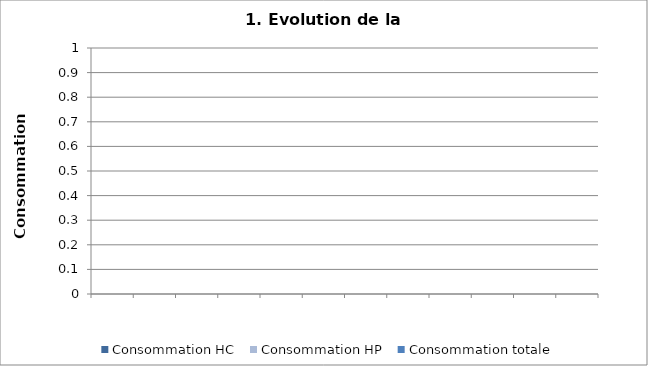
| Category | Consommation HC | Consommation HP | Consommation totale |
|---|---|---|---|
| 0 |  |  | 0 |
| 1 |  |  | 0 |
| 2 |  |  | 0 |
| 3 |  |  | 0 |
| 4 |  |  | 0 |
| 5 |  |  | 0 |
| 6 |  |  | 0 |
| 7 |  |  | 0 |
| 8 |  |  | 0 |
| 9 |  |  | 0 |
| 10 |  |  | 0 |
| 11 |  |  | 0 |